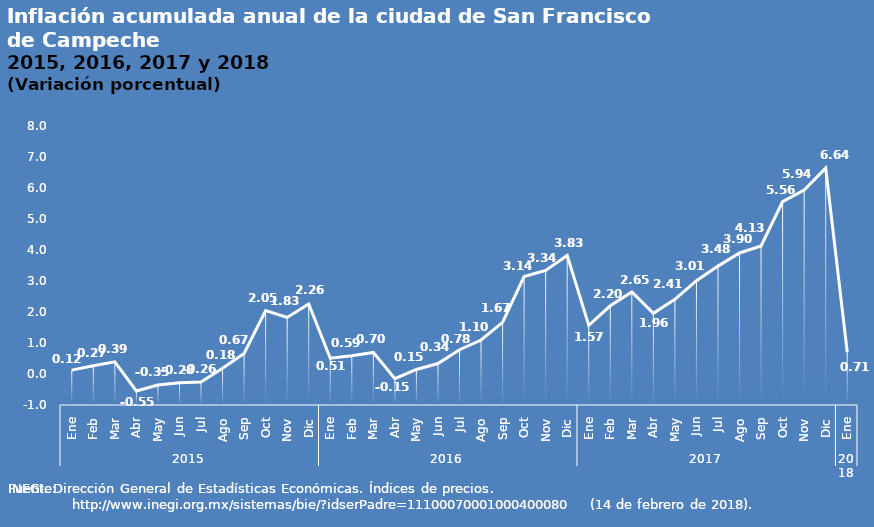
| Category | Inflación |
|---|---|
| 0 | 0.124 |
| 1 | 0.268 |
| 2 | 0.391 |
| 3 | -0.546 |
| 4 | -0.355 |
| 5 | -0.283 |
| 6 | -0.261 |
| 7 | 0.185 |
| 8 | 0.665 |
| 9 | 2.047 |
| 10 | 1.825 |
| 11 | 2.256 |
| 12 | 0.509 |
| 13 | 0.589 |
| 14 | 0.697 |
| 15 | -0.152 |
| 16 | 0.147 |
| 17 | 0.339 |
| 18 | 0.784 |
| 19 | 1.097 |
| 20 | 1.666 |
| 21 | 3.145 |
| 22 | 3.343 |
| 23 | 3.826 |
| 24 | 1.568 |
| 25 | 2.201 |
| 26 | 2.647 |
| 27 | 1.961 |
| 28 | 2.409 |
| 29 | 3.009 |
| 30 | 3.48 |
| 31 | 3.903 |
| 32 | 4.129 |
| 33 | 5.559 |
| 34 | 5.936 |
| 35 | 6.642 |
| 36 | 0.707 |